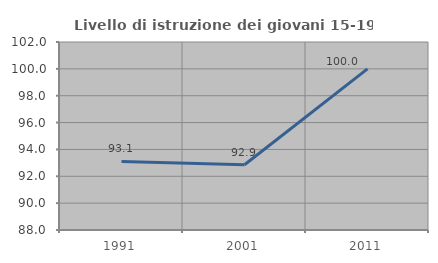
| Category | Livello di istruzione dei giovani 15-19 anni |
|---|---|
| 1991.0 | 93.103 |
| 2001.0 | 92.857 |
| 2011.0 | 100 |